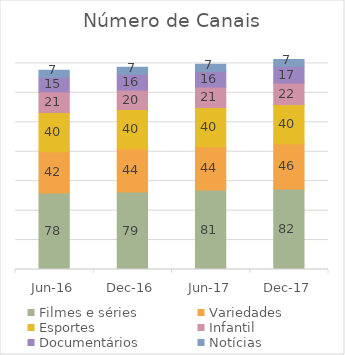
| Category | Filmes e séries | Variedades | Esportes | Infantil | Documentários | Notícias |
|---|---|---|---|---|---|---|
| 2016-06-01 | 78 | 42 | 40 | 21 | 15 | 7 |
| 2016-12-01 | 79 | 44 | 40 | 20 | 16 | 7 |
| 2017-06-01 | 81 | 44 | 40 | 21 | 16 | 7 |
| 2017-12-01 | 82 | 46 | 40 | 22 | 17 | 7 |